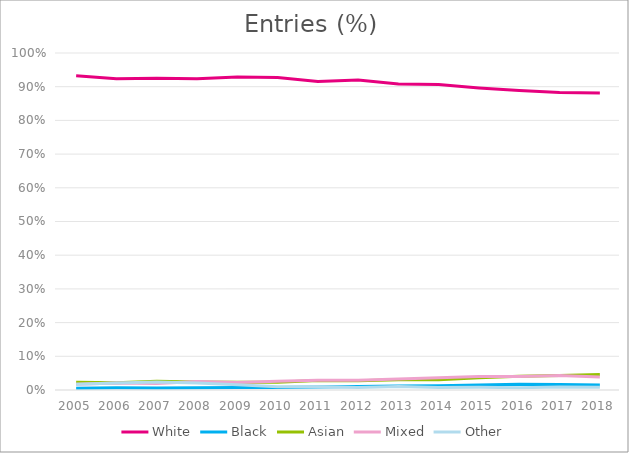
| Category | White | Black | Asian | Mixed | Other |
|---|---|---|---|---|---|
| 2005.0 | 0.932 | 0.005 | 0.023 | 0.017 | 0.017 |
| 2006.0 | 0.924 | 0.007 | 0.021 | 0.021 | 0.021 |
| 2007.0 | 0.925 | 0.006 | 0.026 | 0.019 | 0.024 |
| 2008.0 | 0.923 | 0.007 | 0.024 | 0.025 | 0.02 |
| 2009.0 | 0.929 | 0.007 | 0.023 | 0.022 | 0.016 |
| 2010.0 | 0.927 | 0.007 | 0.023 | 0.026 | 0.01 |
| 2011.0 | 0.915 | 0.009 | 0.028 | 0.029 | 0.01 |
| 2012.0 | 0.92 | 0.01 | 0.027 | 0.029 | 0.008 |
| 2013.0 | 0.908 | 0.012 | 0.03 | 0.032 | 0.01 |
| 2014.0 | 0.906 | 0.013 | 0.03 | 0.037 | 0.007 |
| 2015.0 | 0.896 | 0.015 | 0.036 | 0.04 | 0.008 |
| 2016.0 | 0.889 | 0.017 | 0.041 | 0.04 | 0.007 |
| 2017.0 | 0.883 | 0.017 | 0.043 | 0.043 | 0.009 |
| 2018.0 | 0.881 | 0.015 | 0.046 | 0.038 | 0.008 |